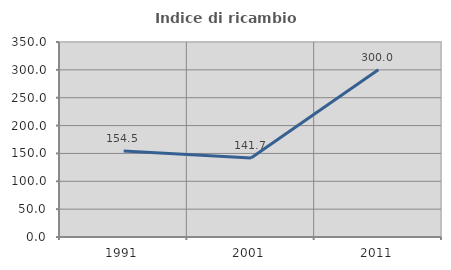
| Category | Indice di ricambio occupazionale  |
|---|---|
| 1991.0 | 154.545 |
| 2001.0 | 141.667 |
| 2011.0 | 300 |